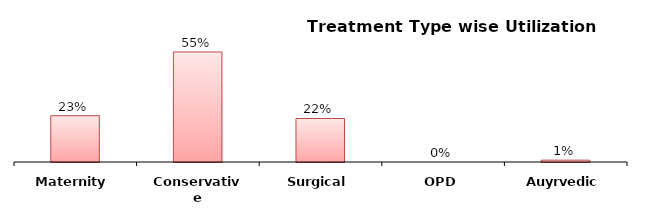
| Category | Series 0 |
|---|---|
| Maternity | 0.229 |
| Conservative | 0.546 |
| Surgical | 0.216 |
| OPD | 0 |
| Auyrvedic | 0.009 |